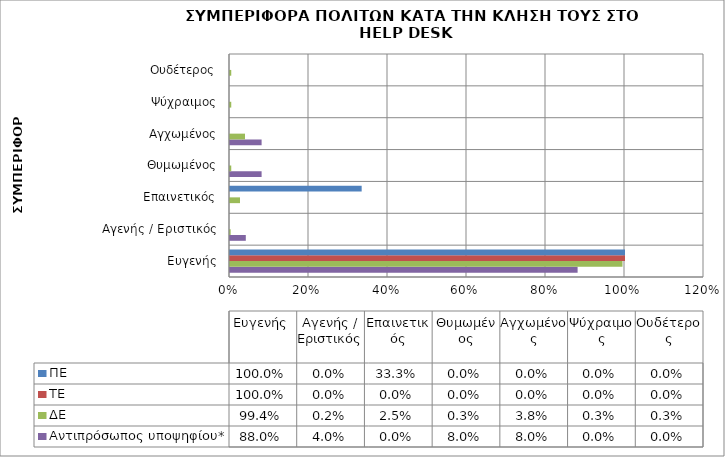
| Category | Αντιπρόσωπος υποψηφίου* | ΔΕ | ΤΕ | ΠΕ |
|---|---|---|---|---|
| Ευγενής | 0.88 | 0.994 | 1 | 1 |
| Αγενής / Εριστικός | 0.04 | 0.002 | 0 | 0 |
| Επαινετικός | 0 | 0.025 | 0 | 0.333 |
| Θυμωμένος | 0.08 | 0.003 | 0 | 0 |
| Αγχωμένος | 0.08 | 0.038 | 0 | 0 |
| Ψύχραιμος | 0 | 0.003 | 0 | 0 |
| Ουδέτερος | 0 | 0.003 | 0 | 0 |